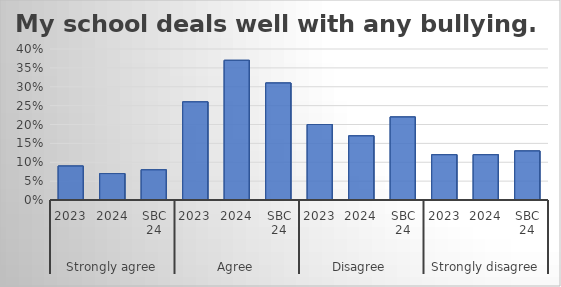
| Category | My school deals well with any bullying. |
|---|---|
| 0 | 0.09 |
| 1 | 0.07 |
| 2 | 0.08 |
| 3 | 0.26 |
| 4 | 0.37 |
| 5 | 0.31 |
| 6 | 0.2 |
| 7 | 0.17 |
| 8 | 0.22 |
| 9 | 0.12 |
| 10 | 0.12 |
| 11 | 0.13 |